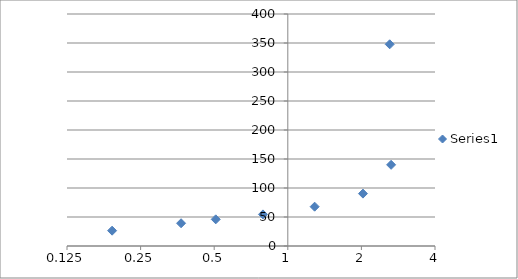
| Category | Series 0 |
|---|---|
| 0.1911441366 | 26.447 |
| 0.36599149 | 39.229 |
| 0.5073109397 | 45.973 |
| 0.7914040829 | 54.492 |
| 1.287747072 | 67.798 |
| 2.029723944 | 90.303 |
| 2.610901175 | 347.782 |
| 2.645789944 | 139.953 |